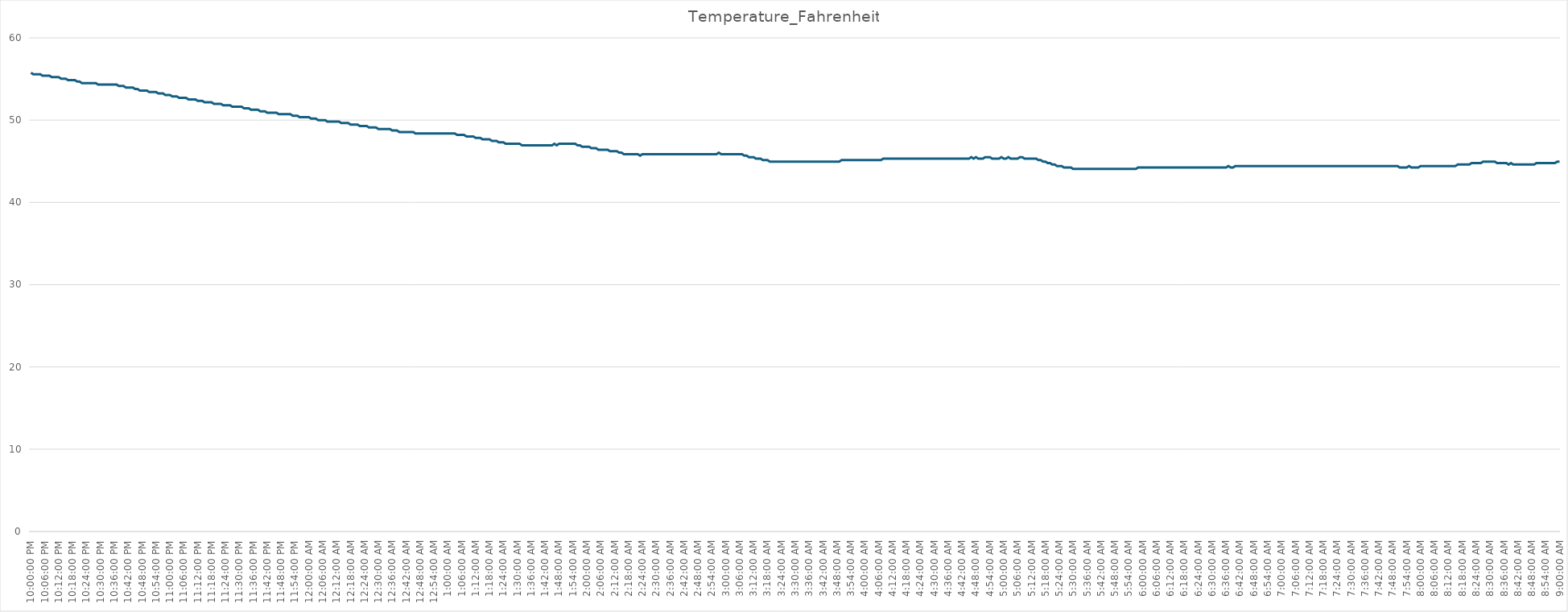
| Category | Temperature_Fahrenheit |
|---|---|
| 2024-03-09 22:00:00 | 55.76 |
| 2024-03-09 22:01:00 | 55.58 |
| 2024-03-09 22:02:00 | 55.58 |
| 2024-03-09 22:03:00 | 55.58 |
| 2024-03-09 22:04:00 | 55.58 |
| 2024-03-09 22:05:00 | 55.4 |
| 2024-03-09 22:06:00 | 55.4 |
| 2024-03-09 22:07:00 | 55.4 |
| 2024-03-09 22:08:00 | 55.4 |
| 2024-03-09 22:09:00 | 55.22 |
| 2024-03-09 22:10:00 | 55.22 |
| 2024-03-09 22:11:00 | 55.22 |
| 2024-03-09 22:12:00 | 55.22 |
| 2024-03-09 22:13:00 | 55.04 |
| 2024-03-09 22:14:00 | 55.04 |
| 2024-03-09 22:15:00 | 55.04 |
| 2024-03-09 22:16:00 | 54.86 |
| 2024-03-09 22:17:00 | 54.86 |
| 2024-03-09 22:18:00 | 54.86 |
| 2024-03-09 22:19:00 | 54.86 |
| 2024-03-09 22:20:00 | 54.68 |
| 2024-03-09 22:21:00 | 54.68 |
| 2024-03-09 22:22:00 | 54.5 |
| 2024-03-09 22:23:00 | 54.5 |
| 2024-03-09 22:24:00 | 54.5 |
| 2024-03-09 22:25:00 | 54.5 |
| 2024-03-09 22:26:00 | 54.5 |
| 2024-03-09 22:27:00 | 54.5 |
| 2024-03-09 22:28:00 | 54.5 |
| 2024-03-09 22:29:00 | 54.32 |
| 2024-03-09 22:30:00 | 54.32 |
| 2024-03-09 22:31:00 | 54.32 |
| 2024-03-09 22:32:00 | 54.32 |
| 2024-03-09 22:33:00 | 54.32 |
| 2024-03-09 22:34:00 | 54.32 |
| 2024-03-09 22:35:00 | 54.32 |
| 2024-03-09 22:36:00 | 54.32 |
| 2024-03-09 22:37:00 | 54.32 |
| 2024-03-09 22:38:00 | 54.14 |
| 2024-03-09 22:39:00 | 54.14 |
| 2024-03-09 22:40:00 | 54.14 |
| 2024-03-09 22:41:00 | 53.96 |
| 2024-03-09 22:42:00 | 53.96 |
| 2024-03-09 22:43:00 | 53.96 |
| 2024-03-09 22:44:00 | 53.96 |
| 2024-03-09 22:45:00 | 53.78 |
| 2024-03-09 22:46:00 | 53.78 |
| 2024-03-09 22:47:00 | 53.6 |
| 2024-03-09 22:48:00 | 53.6 |
| 2024-03-09 22:49:00 | 53.6 |
| 2024-03-09 22:50:00 | 53.6 |
| 2024-03-09 22:51:00 | 53.42 |
| 2024-03-09 22:52:00 | 53.42 |
| 2024-03-09 22:53:00 | 53.42 |
| 2024-03-09 22:54:00 | 53.42 |
| 2024-03-09 22:55:00 | 53.24 |
| 2024-03-09 22:56:00 | 53.24 |
| 2024-03-09 22:57:00 | 53.24 |
| 2024-03-09 22:58:00 | 53.06 |
| 2024-03-09 22:59:00 | 53.06 |
| 2024-03-09 23:00:00 | 53.06 |
| 2024-03-09 23:01:00 | 52.88 |
| 2024-03-09 23:02:00 | 52.88 |
| 2024-03-09 23:03:00 | 52.88 |
| 2024-03-09 23:04:00 | 52.7 |
| 2024-03-09 23:05:00 | 52.7 |
| 2024-03-09 23:06:00 | 52.7 |
| 2024-03-09 23:07:00 | 52.7 |
| 2024-03-09 23:08:00 | 52.52 |
| 2024-03-09 23:09:00 | 52.52 |
| 2024-03-09 23:10:00 | 52.52 |
| 2024-03-09 23:11:00 | 52.52 |
| 2024-03-09 23:12:00 | 52.34 |
| 2024-03-09 23:13:00 | 52.34 |
| 2024-03-09 23:14:00 | 52.34 |
| 2024-03-09 23:15:00 | 52.16 |
| 2024-03-09 23:16:00 | 52.16 |
| 2024-03-09 23:17:00 | 52.16 |
| 2024-03-09 23:18:00 | 52.16 |
| 2024-03-09 23:19:00 | 51.98 |
| 2024-03-09 23:20:00 | 51.98 |
| 2024-03-09 23:21:00 | 51.98 |
| 2024-03-09 23:22:00 | 51.98 |
| 2024-03-09 23:23:00 | 51.8 |
| 2024-03-09 23:24:00 | 51.8 |
| 2024-03-09 23:25:00 | 51.8 |
| 2024-03-09 23:26:00 | 51.8 |
| 2024-03-09 23:27:00 | 51.62 |
| 2024-03-09 23:28:00 | 51.62 |
| 2024-03-09 23:29:00 | 51.62 |
| 2024-03-09 23:30:00 | 51.62 |
| 2024-03-09 23:31:00 | 51.62 |
| 2024-03-09 23:32:00 | 51.44 |
| 2024-03-09 23:33:00 | 51.44 |
| 2024-03-09 23:34:00 | 51.44 |
| 2024-03-09 23:35:00 | 51.26 |
| 2024-03-09 23:36:00 | 51.26 |
| 2024-03-09 23:37:00 | 51.26 |
| 2024-03-09 23:38:00 | 51.26 |
| 2024-03-09 23:39:00 | 51.08 |
| 2024-03-09 23:40:00 | 51.08 |
| 2024-03-09 23:41:00 | 51.08 |
| 2024-03-09 23:42:00 | 50.9 |
| 2024-03-09 23:43:00 | 50.9 |
| 2024-03-09 23:44:00 | 50.9 |
| 2024-03-09 23:45:00 | 50.9 |
| 2024-03-09 23:46:00 | 50.9 |
| 2024-03-09 23:47:00 | 50.72 |
| 2024-03-09 23:48:00 | 50.72 |
| 2024-03-09 23:49:00 | 50.72 |
| 2024-03-09 23:50:00 | 50.72 |
| 2024-03-09 23:51:00 | 50.72 |
| 2024-03-09 23:52:00 | 50.72 |
| 2024-03-09 23:53:00 | 50.54 |
| 2024-03-09 23:54:00 | 50.54 |
| 2024-03-09 23:55:00 | 50.54 |
| 2024-03-09 23:56:00 | 50.36 |
| 2024-03-09 23:57:00 | 50.36 |
| 2024-03-09 23:58:00 | 50.36 |
| 2024-03-09 23:59:00 | 50.36 |
| 2024-03-10 | 50.36 |
| 2024-03-10 00:01:00 | 50.18 |
| 2024-03-10 00:02:00 | 50.18 |
| 2024-03-10 00:03:00 | 50.18 |
| 2024-03-10 00:04:00 | 50 |
| 2024-03-10 00:05:00 | 50 |
| 2024-03-10 00:06:00 | 50 |
| 2024-03-10 00:07:00 | 50 |
| 2024-03-10 00:08:00 | 49.82 |
| 2024-03-10 00:09:00 | 49.82 |
| 2024-03-10 00:10:00 | 49.82 |
| 2024-03-10 00:11:00 | 49.82 |
| 2024-03-10 00:12:00 | 49.82 |
| 2024-03-10 00:13:00 | 49.82 |
| 2024-03-10 00:14:00 | 49.64 |
| 2024-03-10 00:15:00 | 49.64 |
| 2024-03-10 00:16:00 | 49.64 |
| 2024-03-10 00:17:00 | 49.64 |
| 2024-03-10 00:18:00 | 49.46 |
| 2024-03-10 00:19:00 | 49.46 |
| 2024-03-10 00:20:00 | 49.46 |
| 2024-03-10 00:21:00 | 49.46 |
| 2024-03-10 00:22:00 | 49.28 |
| 2024-03-10 00:23:00 | 49.28 |
| 2024-03-10 00:24:00 | 49.28 |
| 2024-03-10 00:25:00 | 49.28 |
| 2024-03-10 00:26:00 | 49.1 |
| 2024-03-10 00:27:00 | 49.1 |
| 2024-03-10 00:28:00 | 49.1 |
| 2024-03-10 00:29:00 | 49.1 |
| 2024-03-10 00:30:00 | 48.92 |
| 2024-03-10 00:31:00 | 48.92 |
| 2024-03-10 00:32:00 | 48.92 |
| 2024-03-10 00:33:00 | 48.92 |
| 2024-03-10 00:34:00 | 48.92 |
| 2024-03-10 00:35:00 | 48.92 |
| 2024-03-10 00:36:00 | 48.74 |
| 2024-03-10 00:37:00 | 48.74 |
| 2024-03-10 00:38:00 | 48.74 |
| 2024-03-10 00:39:00 | 48.56 |
| 2024-03-10 00:40:00 | 48.56 |
| 2024-03-10 00:41:00 | 48.56 |
| 2024-03-10 00:42:00 | 48.56 |
| 2024-03-10 00:43:00 | 48.56 |
| 2024-03-10 00:44:00 | 48.56 |
| 2024-03-10 00:45:00 | 48.56 |
| 2024-03-10 00:46:00 | 48.38 |
| 2024-03-10 00:47:00 | 48.38 |
| 2024-03-10 00:48:00 | 48.38 |
| 2024-03-10 00:49:00 | 48.38 |
| 2024-03-10 00:50:00 | 48.38 |
| 2024-03-10 00:51:00 | 48.38 |
| 2024-03-10 00:52:00 | 48.38 |
| 2024-03-10 00:53:00 | 48.38 |
| 2024-03-10 00:54:00 | 48.38 |
| 2024-03-10 00:55:00 | 48.38 |
| 2024-03-10 00:56:00 | 48.38 |
| 2024-03-10 00:57:00 | 48.38 |
| 2024-03-10 00:58:00 | 48.38 |
| 2024-03-10 00:59:00 | 48.38 |
| 2024-03-10 01:00:00 | 48.38 |
| 2024-03-10 01:01:00 | 48.38 |
| 2024-03-10 01:02:00 | 48.38 |
| 2024-03-10 01:03:00 | 48.38 |
| 2024-03-10 01:04:00 | 48.2 |
| 2024-03-10 01:05:00 | 48.2 |
| 2024-03-10 01:06:00 | 48.2 |
| 2024-03-10 01:07:00 | 48.2 |
| 2024-03-10 01:08:00 | 48.02 |
| 2024-03-10 01:09:00 | 48.02 |
| 2024-03-10 01:10:00 | 48.02 |
| 2024-03-10 01:11:00 | 48.02 |
| 2024-03-10 01:12:00 | 47.84 |
| 2024-03-10 01:13:00 | 47.84 |
| 2024-03-10 01:14:00 | 47.84 |
| 2024-03-10 01:15:00 | 47.66 |
| 2024-03-10 01:16:00 | 47.66 |
| 2024-03-10 01:17:00 | 47.66 |
| 2024-03-10 01:18:00 | 47.66 |
| 2024-03-10 01:19:00 | 47.48 |
| 2024-03-10 01:20:00 | 47.48 |
| 2024-03-10 01:21:00 | 47.48 |
| 2024-03-10 01:22:00 | 47.3 |
| 2024-03-10 01:23:00 | 47.3 |
| 2024-03-10 01:24:00 | 47.3 |
| 2024-03-10 01:25:00 | 47.12 |
| 2024-03-10 01:26:00 | 47.12 |
| 2024-03-10 01:27:00 | 47.12 |
| 2024-03-10 01:28:00 | 47.12 |
| 2024-03-10 01:29:00 | 47.12 |
| 2024-03-10 01:30:00 | 47.12 |
| 2024-03-10 01:31:00 | 47.12 |
| 2024-03-10 01:32:00 | 46.94 |
| 2024-03-10 01:33:00 | 46.94 |
| 2024-03-10 01:34:00 | 46.94 |
| 2024-03-10 01:35:00 | 46.94 |
| 2024-03-10 01:36:00 | 46.94 |
| 2024-03-10 01:37:00 | 46.94 |
| 2024-03-10 01:38:00 | 46.94 |
| 2024-03-10 01:39:00 | 46.94 |
| 2024-03-10 01:40:00 | 46.94 |
| 2024-03-10 01:41:00 | 46.94 |
| 2024-03-10 01:42:00 | 46.94 |
| 2024-03-10 01:43:00 | 46.94 |
| 2024-03-10 01:44:00 | 46.94 |
| 2024-03-10 01:45:00 | 46.94 |
| 2024-03-10 01:46:00 | 47.12 |
| 2024-03-10 01:47:00 | 46.94 |
| 2024-03-10 01:48:00 | 47.12 |
| 2024-03-10 01:49:00 | 47.12 |
| 2024-03-10 01:50:00 | 47.12 |
| 2024-03-10 01:51:00 | 47.12 |
| 2024-03-10 01:52:00 | 47.12 |
| 2024-03-10 01:53:00 | 47.12 |
| 2024-03-10 01:54:00 | 47.12 |
| 2024-03-10 01:55:00 | 47.12 |
| 2024-03-10 01:56:00 | 46.94 |
| 2024-03-10 01:57:00 | 46.94 |
| 2024-03-10 01:58:00 | 46.76 |
| 2024-03-10 01:59:00 | 46.76 |
| 2024-03-10 02:00:00 | 46.76 |
| 2024-03-10 02:01:00 | 46.76 |
| 2024-03-10 02:02:00 | 46.58 |
| 2024-03-10 02:03:00 | 46.58 |
| 2024-03-10 02:04:00 | 46.58 |
| 2024-03-10 02:05:00 | 46.4 |
| 2024-03-10 02:06:00 | 46.4 |
| 2024-03-10 02:07:00 | 46.4 |
| 2024-03-10 02:08:00 | 46.4 |
| 2024-03-10 02:09:00 | 46.4 |
| 2024-03-10 02:10:00 | 46.22 |
| 2024-03-10 02:11:00 | 46.22 |
| 2024-03-10 02:12:00 | 46.22 |
| 2024-03-10 02:13:00 | 46.22 |
| 2024-03-10 02:14:00 | 46.04 |
| 2024-03-10 02:15:00 | 46.04 |
| 2024-03-10 02:16:00 | 45.86 |
| 2024-03-10 02:17:00 | 45.86 |
| 2024-03-10 02:18:00 | 45.86 |
| 2024-03-10 02:19:00 | 45.86 |
| 2024-03-10 02:20:00 | 45.86 |
| 2024-03-10 02:21:00 | 45.86 |
| 2024-03-10 02:22:00 | 45.86 |
| 2024-03-10 02:23:00 | 45.68 |
| 2024-03-10 02:24:00 | 45.86 |
| 2024-03-10 02:25:00 | 45.86 |
| 2024-03-10 02:26:00 | 45.86 |
| 2024-03-10 02:27:00 | 45.86 |
| 2024-03-10 02:28:00 | 45.86 |
| 2024-03-10 02:29:00 | 45.86 |
| 2024-03-10 02:30:00 | 45.86 |
| 2024-03-10 02:31:00 | 45.86 |
| 2024-03-10 02:32:00 | 45.86 |
| 2024-03-10 02:33:00 | 45.86 |
| 2024-03-10 02:34:00 | 45.86 |
| 2024-03-10 02:35:00 | 45.86 |
| 2024-03-10 02:36:00 | 45.86 |
| 2024-03-10 02:37:00 | 45.86 |
| 2024-03-10 02:38:00 | 45.86 |
| 2024-03-10 02:39:00 | 45.86 |
| 2024-03-10 02:40:00 | 45.86 |
| 2024-03-10 02:41:00 | 45.86 |
| 2024-03-10 02:42:00 | 45.86 |
| 2024-03-10 02:43:00 | 45.86 |
| 2024-03-10 02:44:00 | 45.86 |
| 2024-03-10 02:45:00 | 45.86 |
| 2024-03-10 02:46:00 | 45.86 |
| 2024-03-10 02:47:00 | 45.86 |
| 2024-03-10 02:48:00 | 45.86 |
| 2024-03-10 02:49:00 | 45.86 |
| 2024-03-10 02:50:00 | 45.86 |
| 2024-03-10 02:51:00 | 45.86 |
| 2024-03-10 02:52:00 | 45.86 |
| 2024-03-10 02:53:00 | 45.86 |
| 2024-03-10 02:54:00 | 45.86 |
| 2024-03-10 02:55:00 | 45.86 |
| 2024-03-10 02:56:00 | 45.86 |
| 2024-03-10 02:57:00 | 46.04 |
| 2024-03-10 02:58:00 | 45.86 |
| 2024-03-10 02:59:00 | 45.86 |
| 2024-03-10 03:00:00 | 45.86 |
| 2024-03-10 03:01:00 | 45.86 |
| 2024-03-10 03:02:00 | 45.86 |
| 2024-03-10 03:03:00 | 45.86 |
| 2024-03-10 03:04:00 | 45.86 |
| 2024-03-10 03:05:00 | 45.86 |
| 2024-03-10 03:06:00 | 45.86 |
| 2024-03-10 03:07:00 | 45.86 |
| 2024-03-10 03:08:00 | 45.68 |
| 2024-03-10 03:09:00 | 45.68 |
| 2024-03-10 03:10:00 | 45.5 |
| 2024-03-10 03:11:00 | 45.5 |
| 2024-03-10 03:12:00 | 45.5 |
| 2024-03-10 03:13:00 | 45.32 |
| 2024-03-10 03:14:00 | 45.32 |
| 2024-03-10 03:15:00 | 45.32 |
| 2024-03-10 03:16:00 | 45.14 |
| 2024-03-10 03:17:00 | 45.14 |
| 2024-03-10 03:18:00 | 45.14 |
| 2024-03-10 03:19:00 | 44.96 |
| 2024-03-10 03:20:00 | 44.96 |
| 2024-03-10 03:21:00 | 44.96 |
| 2024-03-10 03:22:00 | 44.96 |
| 2024-03-10 03:23:00 | 44.96 |
| 2024-03-10 03:24:00 | 44.96 |
| 2024-03-10 03:25:00 | 44.96 |
| 2024-03-10 03:26:00 | 44.96 |
| 2024-03-10 03:27:00 | 44.96 |
| 2024-03-10 03:28:00 | 44.96 |
| 2024-03-10 03:29:00 | 44.96 |
| 2024-03-10 03:30:00 | 44.96 |
| 2024-03-10 03:31:00 | 44.96 |
| 2024-03-10 03:32:00 | 44.96 |
| 2024-03-10 03:33:00 | 44.96 |
| 2024-03-10 03:34:00 | 44.96 |
| 2024-03-10 03:35:00 | 44.96 |
| 2024-03-10 03:36:00 | 44.96 |
| 2024-03-10 03:37:00 | 44.96 |
| 2024-03-10 03:38:00 | 44.96 |
| 2024-03-10 03:39:00 | 44.96 |
| 2024-03-10 03:40:00 | 44.96 |
| 2024-03-10 03:41:00 | 44.96 |
| 2024-03-10 03:42:00 | 44.96 |
| 2024-03-10 03:43:00 | 44.96 |
| 2024-03-10 03:44:00 | 44.96 |
| 2024-03-10 03:45:00 | 44.96 |
| 2024-03-10 03:46:00 | 44.96 |
| 2024-03-10 03:47:00 | 44.96 |
| 2024-03-10 03:48:00 | 44.96 |
| 2024-03-10 03:49:00 | 44.96 |
| 2024-03-10 03:50:00 | 45.14 |
| 2024-03-10 03:51:00 | 45.14 |
| 2024-03-10 03:52:00 | 45.14 |
| 2024-03-10 03:53:00 | 45.14 |
| 2024-03-10 03:54:00 | 45.14 |
| 2024-03-10 03:55:00 | 45.14 |
| 2024-03-10 03:56:00 | 45.14 |
| 2024-03-10 03:57:00 | 45.14 |
| 2024-03-10 03:58:00 | 45.14 |
| 2024-03-10 03:59:00 | 45.14 |
| 2024-03-10 04:00:00 | 45.14 |
| 2024-03-10 04:01:00 | 45.14 |
| 2024-03-10 04:02:00 | 45.14 |
| 2024-03-10 04:03:00 | 45.14 |
| 2024-03-10 04:04:00 | 45.14 |
| 2024-03-10 04:05:00 | 45.14 |
| 2024-03-10 04:06:00 | 45.14 |
| 2024-03-10 04:07:00 | 45.14 |
| 2024-03-10 04:08:00 | 45.32 |
| 2024-03-10 04:09:00 | 45.32 |
| 2024-03-10 04:10:00 | 45.32 |
| 2024-03-10 04:11:00 | 45.32 |
| 2024-03-10 04:12:00 | 45.32 |
| 2024-03-10 04:13:00 | 45.32 |
| 2024-03-10 04:14:00 | 45.32 |
| 2024-03-10 04:15:00 | 45.32 |
| 2024-03-10 04:16:00 | 45.32 |
| 2024-03-10 04:17:00 | 45.32 |
| 2024-03-10 04:18:00 | 45.32 |
| 2024-03-10 04:19:00 | 45.32 |
| 2024-03-10 04:20:00 | 45.32 |
| 2024-03-10 04:21:00 | 45.32 |
| 2024-03-10 04:22:00 | 45.32 |
| 2024-03-10 04:23:00 | 45.32 |
| 2024-03-10 04:24:00 | 45.32 |
| 2024-03-10 04:25:00 | 45.32 |
| 2024-03-10 04:26:00 | 45.32 |
| 2024-03-10 04:27:00 | 45.32 |
| 2024-03-10 04:28:00 | 45.32 |
| 2024-03-10 04:29:00 | 45.32 |
| 2024-03-10 04:30:00 | 45.32 |
| 2024-03-10 04:31:00 | 45.32 |
| 2024-03-10 04:32:00 | 45.32 |
| 2024-03-10 04:33:00 | 45.32 |
| 2024-03-10 04:34:00 | 45.32 |
| 2024-03-10 04:35:00 | 45.32 |
| 2024-03-10 04:36:00 | 45.32 |
| 2024-03-10 04:37:00 | 45.32 |
| 2024-03-10 04:38:00 | 45.32 |
| 2024-03-10 04:39:00 | 45.32 |
| 2024-03-10 04:40:00 | 45.32 |
| 2024-03-10 04:41:00 | 45.32 |
| 2024-03-10 04:42:00 | 45.32 |
| 2024-03-10 04:43:00 | 45.32 |
| 2024-03-10 04:44:00 | 45.32 |
| 2024-03-10 04:45:00 | 45.32 |
| 2024-03-10 04:46:00 | 45.5 |
| 2024-03-10 04:47:00 | 45.32 |
| 2024-03-10 04:48:00 | 45.5 |
| 2024-03-10 04:49:00 | 45.32 |
| 2024-03-10 04:50:00 | 45.32 |
| 2024-03-10 04:51:00 | 45.32 |
| 2024-03-10 04:52:00 | 45.5 |
| 2024-03-10 04:53:00 | 45.5 |
| 2024-03-10 04:54:00 | 45.5 |
| 2024-03-10 04:55:00 | 45.32 |
| 2024-03-10 04:56:00 | 45.32 |
| 2024-03-10 04:57:00 | 45.32 |
| 2024-03-10 04:58:00 | 45.32 |
| 2024-03-10 04:59:00 | 45.5 |
| 2024-03-10 05:00:00 | 45.32 |
| 2024-03-10 05:01:00 | 45.32 |
| 2024-03-10 05:02:00 | 45.5 |
| 2024-03-10 05:03:00 | 45.32 |
| 2024-03-10 05:04:00 | 45.32 |
| 2024-03-10 05:05:00 | 45.32 |
| 2024-03-10 05:06:00 | 45.32 |
| 2024-03-10 05:07:00 | 45.5 |
| 2024-03-10 05:08:00 | 45.5 |
| 2024-03-10 05:09:00 | 45.32 |
| 2024-03-10 05:10:00 | 45.32 |
| 2024-03-10 05:11:00 | 45.32 |
| 2024-03-10 05:12:00 | 45.32 |
| 2024-03-10 05:13:00 | 45.32 |
| 2024-03-10 05:14:00 | 45.32 |
| 2024-03-10 05:15:00 | 45.14 |
| 2024-03-10 05:16:00 | 45.14 |
| 2024-03-10 05:17:00 | 44.96 |
| 2024-03-10 05:18:00 | 44.96 |
| 2024-03-10 05:19:00 | 44.78 |
| 2024-03-10 05:20:00 | 44.78 |
| 2024-03-10 05:21:00 | 44.6 |
| 2024-03-10 05:22:00 | 44.6 |
| 2024-03-10 05:23:00 | 44.42 |
| 2024-03-10 05:24:00 | 44.42 |
| 2024-03-10 05:25:00 | 44.42 |
| 2024-03-10 05:26:00 | 44.24 |
| 2024-03-10 05:27:00 | 44.24 |
| 2024-03-10 05:28:00 | 44.24 |
| 2024-03-10 05:29:00 | 44.24 |
| 2024-03-10 05:30:00 | 44.06 |
| 2024-03-10 05:31:00 | 44.06 |
| 2024-03-10 05:32:00 | 44.06 |
| 2024-03-10 05:33:00 | 44.06 |
| 2024-03-10 05:34:00 | 44.06 |
| 2024-03-10 05:35:00 | 44.06 |
| 2024-03-10 05:36:00 | 44.06 |
| 2024-03-10 05:37:00 | 44.06 |
| 2024-03-10 05:38:00 | 44.06 |
| 2024-03-10 05:39:00 | 44.06 |
| 2024-03-10 05:40:00 | 44.06 |
| 2024-03-10 05:41:00 | 44.06 |
| 2024-03-10 05:42:00 | 44.06 |
| 2024-03-10 05:43:00 | 44.06 |
| 2024-03-10 05:44:00 | 44.06 |
| 2024-03-10 05:45:00 | 44.06 |
| 2024-03-10 05:46:00 | 44.06 |
| 2024-03-10 05:47:00 | 44.06 |
| 2024-03-10 05:48:00 | 44.06 |
| 2024-03-10 05:49:00 | 44.06 |
| 2024-03-10 05:50:00 | 44.06 |
| 2024-03-10 05:51:00 | 44.06 |
| 2024-03-10 05:52:00 | 44.06 |
| 2024-03-10 05:53:00 | 44.06 |
| 2024-03-10 05:54:00 | 44.06 |
| 2024-03-10 05:55:00 | 44.06 |
| 2024-03-10 05:56:00 | 44.06 |
| 2024-03-10 05:57:00 | 44.06 |
| 2024-03-10 05:58:00 | 44.24 |
| 2024-03-10 05:59:00 | 44.24 |
| 2024-03-10 06:00:00 | 44.24 |
| 2024-03-10 06:01:00 | 44.24 |
| 2024-03-10 06:02:00 | 44.24 |
| 2024-03-10 06:03:00 | 44.24 |
| 2024-03-10 06:04:00 | 44.24 |
| 2024-03-10 06:05:00 | 44.24 |
| 2024-03-10 06:06:00 | 44.24 |
| 2024-03-10 06:07:00 | 44.24 |
| 2024-03-10 06:08:00 | 44.24 |
| 2024-03-10 06:09:00 | 44.24 |
| 2024-03-10 06:10:00 | 44.24 |
| 2024-03-10 06:11:00 | 44.24 |
| 2024-03-10 06:12:00 | 44.24 |
| 2024-03-10 06:13:00 | 44.24 |
| 2024-03-10 06:14:00 | 44.24 |
| 2024-03-10 06:15:00 | 44.24 |
| 2024-03-10 06:16:00 | 44.24 |
| 2024-03-10 06:17:00 | 44.24 |
| 2024-03-10 06:18:00 | 44.24 |
| 2024-03-10 06:19:00 | 44.24 |
| 2024-03-10 06:20:00 | 44.24 |
| 2024-03-10 06:21:00 | 44.24 |
| 2024-03-10 06:22:00 | 44.24 |
| 2024-03-10 06:23:00 | 44.24 |
| 2024-03-10 06:24:00 | 44.24 |
| 2024-03-10 06:25:00 | 44.24 |
| 2024-03-10 06:26:00 | 44.24 |
| 2024-03-10 06:27:00 | 44.24 |
| 2024-03-10 06:28:00 | 44.24 |
| 2024-03-10 06:29:00 | 44.24 |
| 2024-03-10 06:30:00 | 44.24 |
| 2024-03-10 06:31:00 | 44.24 |
| 2024-03-10 06:32:00 | 44.24 |
| 2024-03-10 06:33:00 | 44.24 |
| 2024-03-10 06:34:00 | 44.24 |
| 2024-03-10 06:35:00 | 44.24 |
| 2024-03-10 06:36:00 | 44.24 |
| 2024-03-10 06:37:00 | 44.42 |
| 2024-03-10 06:38:00 | 44.24 |
| 2024-03-10 06:39:00 | 44.24 |
| 2024-03-10 06:40:00 | 44.42 |
| 2024-03-10 06:41:00 | 44.42 |
| 2024-03-10 06:42:00 | 44.42 |
| 2024-03-10 06:43:00 | 44.42 |
| 2024-03-10 06:44:00 | 44.42 |
| 2024-03-10 06:45:00 | 44.42 |
| 2024-03-10 06:46:00 | 44.42 |
| 2024-03-10 06:47:00 | 44.42 |
| 2024-03-10 06:48:00 | 44.42 |
| 2024-03-10 06:49:00 | 44.42 |
| 2024-03-10 06:50:00 | 44.42 |
| 2024-03-10 06:51:00 | 44.42 |
| 2024-03-10 06:52:00 | 44.42 |
| 2024-03-10 06:53:00 | 44.42 |
| 2024-03-10 06:54:00 | 44.42 |
| 2024-03-10 06:55:00 | 44.42 |
| 2024-03-10 06:56:00 | 44.42 |
| 2024-03-10 06:57:00 | 44.42 |
| 2024-03-10 06:58:00 | 44.42 |
| 2024-03-10 06:59:00 | 44.42 |
| 2024-03-10 07:00:00 | 44.42 |
| 2024-03-10 07:01:00 | 44.42 |
| 2024-03-10 07:02:00 | 44.42 |
| 2024-03-10 07:03:00 | 44.42 |
| 2024-03-10 07:04:00 | 44.42 |
| 2024-03-10 07:05:00 | 44.42 |
| 2024-03-10 07:06:00 | 44.42 |
| 2024-03-10 07:07:00 | 44.42 |
| 2024-03-10 07:08:00 | 44.42 |
| 2024-03-10 07:09:00 | 44.42 |
| 2024-03-10 07:10:00 | 44.42 |
| 2024-03-10 07:11:00 | 44.42 |
| 2024-03-10 07:12:00 | 44.42 |
| 2024-03-10 07:13:00 | 44.42 |
| 2024-03-10 07:14:00 | 44.42 |
| 2024-03-10 07:15:00 | 44.42 |
| 2024-03-10 07:16:00 | 44.42 |
| 2024-03-10 07:17:00 | 44.42 |
| 2024-03-10 07:18:00 | 44.42 |
| 2024-03-10 07:19:00 | 44.42 |
| 2024-03-10 07:20:00 | 44.42 |
| 2024-03-10 07:21:00 | 44.42 |
| 2024-03-10 07:22:00 | 44.42 |
| 2024-03-10 07:23:00 | 44.42 |
| 2024-03-10 07:24:00 | 44.42 |
| 2024-03-10 07:25:00 | 44.42 |
| 2024-03-10 07:26:00 | 44.42 |
| 2024-03-10 07:27:00 | 44.42 |
| 2024-03-10 07:28:00 | 44.42 |
| 2024-03-10 07:29:00 | 44.42 |
| 2024-03-10 07:30:00 | 44.42 |
| 2024-03-10 07:31:00 | 44.42 |
| 2024-03-10 07:32:00 | 44.42 |
| 2024-03-10 07:33:00 | 44.42 |
| 2024-03-10 07:34:00 | 44.42 |
| 2024-03-10 07:35:00 | 44.42 |
| 2024-03-10 07:36:00 | 44.42 |
| 2024-03-10 07:37:00 | 44.42 |
| 2024-03-10 07:38:00 | 44.42 |
| 2024-03-10 07:39:00 | 44.42 |
| 2024-03-10 07:40:00 | 44.42 |
| 2024-03-10 07:41:00 | 44.42 |
| 2024-03-10 07:42:00 | 44.42 |
| 2024-03-10 07:43:00 | 44.42 |
| 2024-03-10 07:44:00 | 44.42 |
| 2024-03-10 07:45:00 | 44.42 |
| 2024-03-10 07:46:00 | 44.42 |
| 2024-03-10 07:47:00 | 44.42 |
| 2024-03-10 07:48:00 | 44.42 |
| 2024-03-10 07:49:00 | 44.42 |
| 2024-03-10 07:50:00 | 44.42 |
| 2024-03-10 07:51:00 | 44.24 |
| 2024-03-10 07:52:00 | 44.24 |
| 2024-03-10 07:53:00 | 44.24 |
| 2024-03-10 07:54:00 | 44.24 |
| 2024-03-10 07:55:00 | 44.42 |
| 2024-03-10 07:56:00 | 44.24 |
| 2024-03-10 07:57:00 | 44.24 |
| 2024-03-10 07:58:00 | 44.24 |
| 2024-03-10 07:59:00 | 44.24 |
| 2024-03-10 08:00:00 | 44.42 |
| 2024-03-10 08:01:00 | 44.42 |
| 2024-03-10 08:02:00 | 44.42 |
| 2024-03-10 08:03:00 | 44.42 |
| 2024-03-10 08:04:00 | 44.42 |
| 2024-03-10 08:05:00 | 44.42 |
| 2024-03-10 08:06:00 | 44.42 |
| 2024-03-10 08:07:00 | 44.42 |
| 2024-03-10 08:08:00 | 44.42 |
| 2024-03-10 08:09:00 | 44.42 |
| 2024-03-10 08:10:00 | 44.42 |
| 2024-03-10 08:11:00 | 44.42 |
| 2024-03-10 08:12:00 | 44.42 |
| 2024-03-10 08:13:00 | 44.42 |
| 2024-03-10 08:14:00 | 44.42 |
| 2024-03-10 08:15:00 | 44.42 |
| 2024-03-10 08:16:00 | 44.6 |
| 2024-03-10 08:17:00 | 44.6 |
| 2024-03-10 08:18:00 | 44.6 |
| 2024-03-10 08:19:00 | 44.6 |
| 2024-03-10 08:20:00 | 44.6 |
| 2024-03-10 08:21:00 | 44.6 |
| 2024-03-10 08:22:00 | 44.78 |
| 2024-03-10 08:23:00 | 44.78 |
| 2024-03-10 08:24:00 | 44.78 |
| 2024-03-10 08:25:00 | 44.78 |
| 2024-03-10 08:26:00 | 44.78 |
| 2024-03-10 08:27:00 | 44.96 |
| 2024-03-10 08:28:00 | 44.96 |
| 2024-03-10 08:29:00 | 44.96 |
| 2024-03-10 08:30:00 | 44.96 |
| 2024-03-10 08:31:00 | 44.96 |
| 2024-03-10 08:32:00 | 44.96 |
| 2024-03-10 08:33:00 | 44.78 |
| 2024-03-10 08:34:00 | 44.78 |
| 2024-03-10 08:35:00 | 44.78 |
| 2024-03-10 08:36:00 | 44.78 |
| 2024-03-10 08:37:00 | 44.78 |
| 2024-03-10 08:38:00 | 44.6 |
| 2024-03-10 08:39:00 | 44.78 |
| 2024-03-10 08:40:00 | 44.6 |
| 2024-03-10 08:41:00 | 44.6 |
| 2024-03-10 08:42:00 | 44.6 |
| 2024-03-10 08:43:00 | 44.6 |
| 2024-03-10 08:44:00 | 44.6 |
| 2024-03-10 08:45:00 | 44.6 |
| 2024-03-10 08:46:00 | 44.6 |
| 2024-03-10 08:47:00 | 44.6 |
| 2024-03-10 08:48:00 | 44.6 |
| 2024-03-10 08:49:00 | 44.6 |
| 2024-03-10 08:50:00 | 44.78 |
| 2024-03-10 08:51:00 | 44.78 |
| 2024-03-10 08:52:00 | 44.78 |
| 2024-03-10 08:53:00 | 44.78 |
| 2024-03-10 08:54:00 | 44.78 |
| 2024-03-10 08:55:00 | 44.78 |
| 2024-03-10 08:56:00 | 44.78 |
| 2024-03-10 08:57:00 | 44.78 |
| 2024-03-10 08:58:00 | 44.78 |
| 2024-03-10 08:59:00 | 44.96 |
| 2024-03-10 09:00:00 | 44.96 |